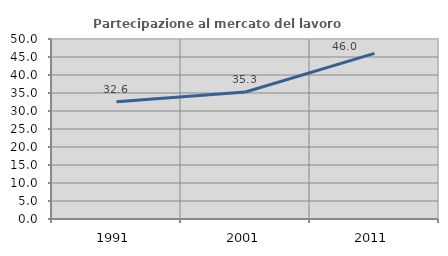
| Category | Partecipazione al mercato del lavoro  femminile |
|---|---|
| 1991.0 | 32.571 |
| 2001.0 | 35.294 |
| 2011.0 | 46.023 |